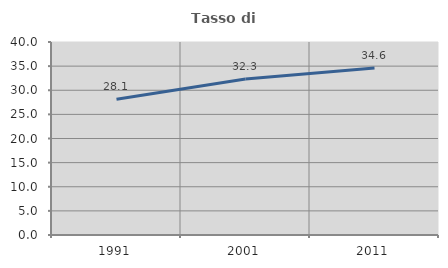
| Category | Tasso di occupazione   |
|---|---|
| 1991.0 | 28.125 |
| 2001.0 | 32.312 |
| 2011.0 | 34.628 |